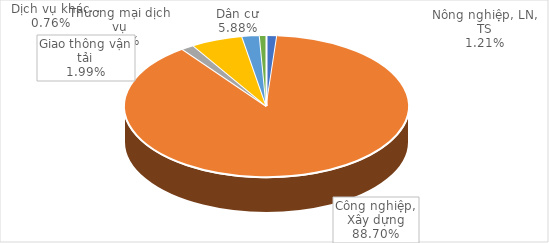
| Category | Series 0 |
|---|---|
| Nông nghiệp, LN, TS | 61213.477 |
| Công nghiệp, Xây dựng | 4502706.94 |
| Thương mại dịch vụ | 74017.47 |
| Dân cư | 298672.434 |
| Giao thông vận tải | 100930.297 |
| Dịch vụ khác | 38610.023 |